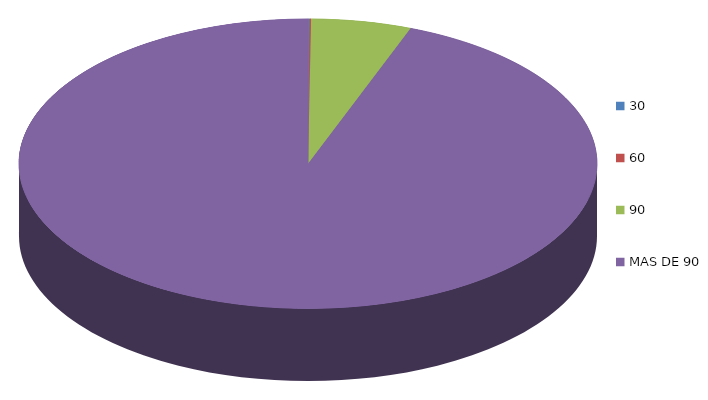
| Category | Series 0 | 52,978.3 |
|---|---|---|
| 0 | 52978.3 |  |
| 1 | 57389.1 |  |
| 2 | 3624698.6 |  |
| 3 | 61013153.4 |  |